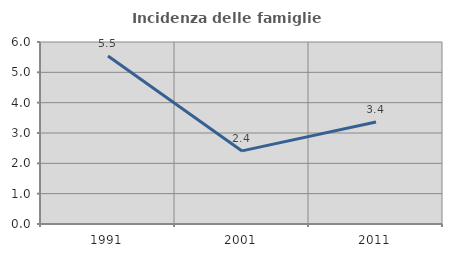
| Category | Incidenza delle famiglie numerose |
|---|---|
| 1991.0 | 5.54 |
| 2001.0 | 2.41 |
| 2011.0 | 3.365 |